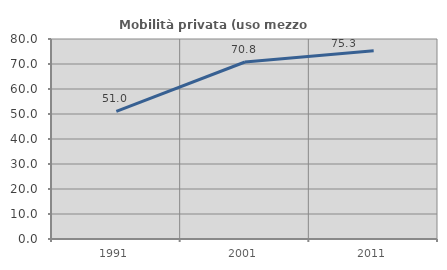
| Category | Mobilità privata (uso mezzo privato) |
|---|---|
| 1991.0 | 51.024 |
| 2001.0 | 70.794 |
| 2011.0 | 75.264 |